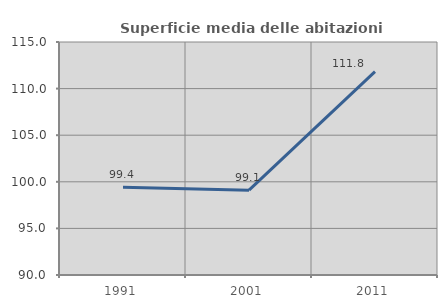
| Category | Superficie media delle abitazioni occupate |
|---|---|
| 1991.0 | 99.427 |
| 2001.0 | 99.102 |
| 2011.0 | 111.826 |